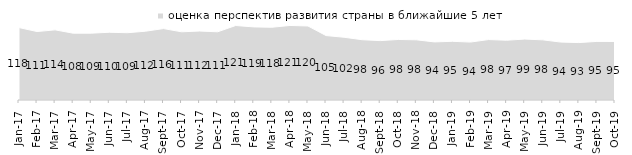
| Category | оценка перспектив развития страны в ближайшие 5 лет |
|---|---|
| 2017-01-01 | 117.55 |
| 2017-02-01 | 111.15 |
| 2017-03-01 | 113.85 |
| 2017-04-01 | 108.45 |
| 2017-05-01 | 108.5 |
| 2017-06-01 | 109.95 |
| 2017-07-01 | 109.2 |
| 2017-08-01 | 111.65 |
| 2017-09-01 | 115.95 |
| 2017-10-01 | 110.7 |
| 2017-11-01 | 111.95 |
| 2017-12-01 | 110.7 |
| 2018-01-01 | 120.9 |
| 2018-02-01 | 118.65 |
| 2018-03-01 | 118.1 |
| 2018-04-01 | 121 |
| 2018-05-01 | 120.15 |
| 2018-06-01 | 104.6 |
| 2018-07-01 | 101.85 |
| 2018-08-01 | 97.85 |
| 2018-09-01 | 96.4 |
| 2018-10-01 | 98.25 |
| 2018-11-01 | 97.705 |
| 2018-12-01 | 94.3 |
| 2019-01-01 | 95.25 |
| 2019-02-01 | 94.05 |
| 2019-03-01 | 98.11 |
| 2019-04-01 | 97.03 |
| 2019-05-01 | 98.91 |
| 2019-06-01 | 97.656 |
| 2019-07-01 | 94.01 |
| 2019-08-01 | 93.207 |
| 2019-09-01 | 95.099 |
| 2019-10-01 | 95 |